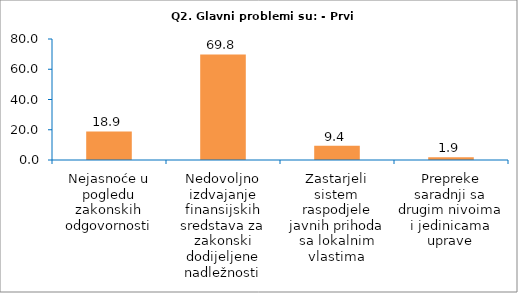
| Category | Series 0 |
|---|---|
| Nejasnoće u pogledu zakonskih odgovornosti | 18.868 |
| Nedovoljno izdvajanje finansijskih sredstava za zakonski dodijeljene nadležnosti | 69.811 |
| Zastarjeli sistem raspodjele javnih prihoda sa lokalnim vlastima | 9.434 |
| Prepreke saradnji sa drugim nivoima i jedinicama uprave | 1.887 |